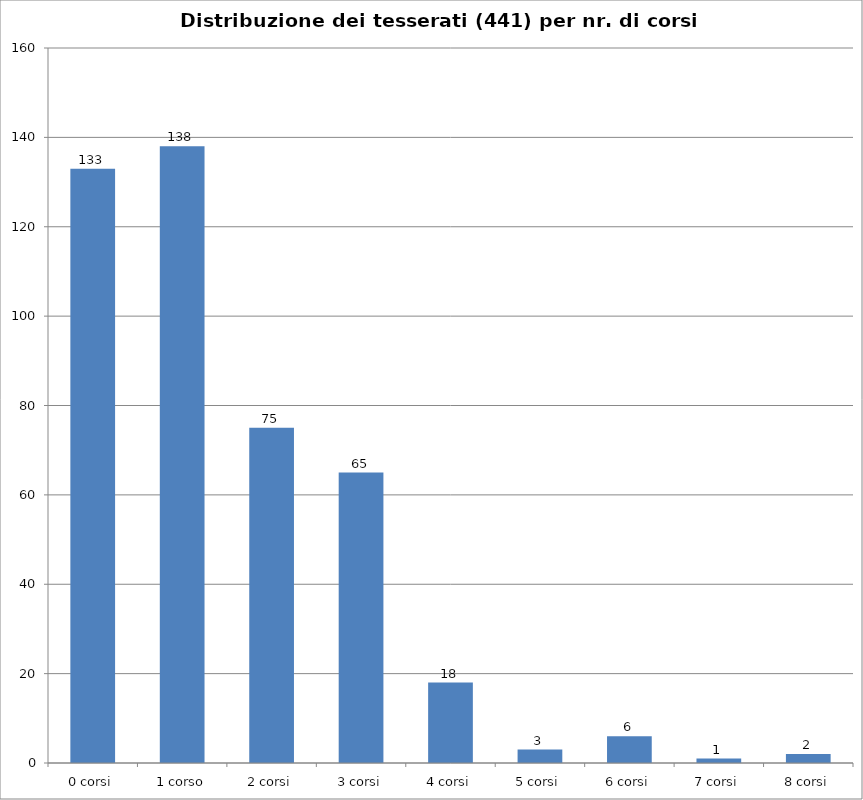
| Category | Nr. Tesserati |
|---|---|
| 0 corsi | 133 |
| 1 corso | 138 |
| 2 corsi | 75 |
| 3 corsi | 65 |
| 4 corsi | 18 |
| 5 corsi | 3 |
| 6 corsi | 6 |
| 7 corsi | 1 |
| 8 corsi | 2 |